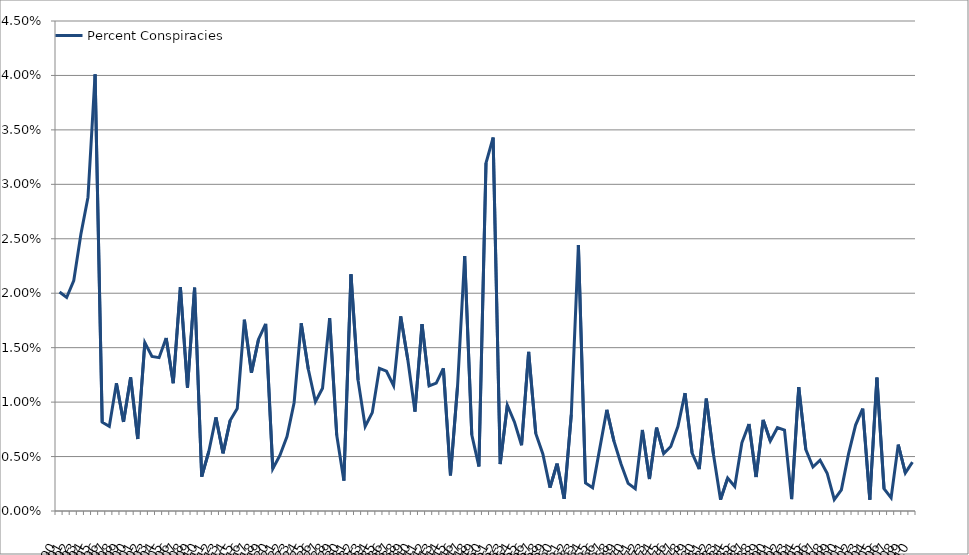
| Category | Percent Conspiracies |
|---|---|
| 1890.0 | 0.02 |
| 1891.0 | 0.02 |
| 1892.0 | 0.021 |
| 1893.0 | 0.025 |
| 1894.0 | 0.029 |
| 1895.0 | 0.04 |
| 1896.0 | 0.008 |
| 1897.0 | 0.008 |
| 1898.0 | 0.012 |
| 1899.0 | 0.008 |
| 1900.0 | 0.012 |
| 1901.0 | 0.007 |
| 1902.0 | 0.015 |
| 1903.0 | 0.014 |
| 1904.0 | 0.014 |
| 1905.0 | 0.016 |
| 1906.0 | 0.012 |
| 1907.0 | 0.021 |
| 1908.0 | 0.011 |
| 1909.0 | 0.021 |
| 1910.0 | 0.003 |
| 1911.0 | 0.005 |
| 1912.0 | 0.009 |
| 1913.0 | 0.005 |
| 1914.0 | 0.008 |
| 1915.0 | 0.009 |
| 1916.0 | 0.018 |
| 1917.0 | 0.013 |
| 1918.0 | 0.016 |
| 1919.0 | 0.017 |
| 1920.0 | 0.004 |
| 1921.0 | 0.005 |
| 1922.0 | 0.007 |
| 1923.0 | 0.01 |
| 1924.0 | 0.017 |
| 1925.0 | 0.013 |
| 1926.0 | 0.01 |
| 1927.0 | 0.011 |
| 1928.0 | 0.018 |
| 1929.0 | 0.007 |
| 1930.0 | 0.003 |
| 1931.0 | 0.022 |
| 1932.0 | 0.012 |
| 1933.0 | 0.008 |
| 1934.0 | 0.009 |
| 1935.0 | 0.013 |
| 1936.0 | 0.013 |
| 1937.0 | 0.012 |
| 1938.0 | 0.018 |
| 1939.0 | 0.014 |
| 1940.0 | 0.009 |
| 1941.0 | 0.017 |
| 1942.0 | 0.011 |
| 1943.0 | 0.012 |
| 1944.0 | 0.013 |
| 1945.0 | 0.003 |
| 1946.0 | 0.011 |
| 1947.0 | 0.023 |
| 1948.0 | 0.007 |
| 1949.0 | 0.004 |
| 1950.0 | 0.032 |
| 1951.0 | 0.034 |
| 1952.0 | 0.004 |
| 1953.0 | 0.01 |
| 1954.0 | 0.008 |
| 1955.0 | 0.006 |
| 1956.0 | 0.015 |
| 1957.0 | 0.007 |
| 1958.0 | 0.005 |
| 1959.0 | 0.002 |
| 1960.0 | 0.004 |
| 1961.0 | 0.001 |
| 1962.0 | 0.009 |
| 1963.0 | 0.024 |
| 1964.0 | 0.003 |
| 1965.0 | 0.002 |
| 1966.0 | 0.006 |
| 1967.0 | 0.009 |
| 1968.0 | 0.006 |
| 1969.0 | 0.004 |
| 1970.0 | 0.003 |
| 1971.0 | 0.002 |
| 1972.0 | 0.007 |
| 1973.0 | 0.003 |
| 1974.0 | 0.008 |
| 1975.0 | 0.005 |
| 1976.0 | 0.006 |
| 1977.0 | 0.008 |
| 1978.0 | 0.011 |
| 1979.0 | 0.005 |
| 1980.0 | 0.004 |
| 1981.0 | 0.01 |
| 1982.0 | 0.005 |
| 1983.0 | 0.001 |
| 1984.0 | 0.003 |
| 1985.0 | 0.002 |
| 1986.0 | 0.006 |
| 1987.0 | 0.008 |
| 1988.0 | 0.003 |
| 1989.0 | 0.008 |
| 1990.0 | 0.006 |
| 1991.0 | 0.008 |
| 1992.0 | 0.007 |
| 1993.0 | 0.001 |
| 1994.0 | 0.011 |
| 1995.0 | 0.006 |
| 1996.0 | 0.004 |
| 1997.0 | 0.005 |
| 1998.0 | 0.003 |
| 1999.0 | 0.001 |
| 2000.0 | 0.002 |
| 2001.0 | 0.005 |
| 2002.0 | 0.008 |
| 2003.0 | 0.009 |
| 2004.0 | 0.001 |
| 2005.0 | 0.012 |
| 2006.0 | 0.002 |
| 2007.0 | 0.001 |
| 2008.0 | 0.006 |
| 2009.0 | 0.003 |
| 2010.0 | 0.004 |